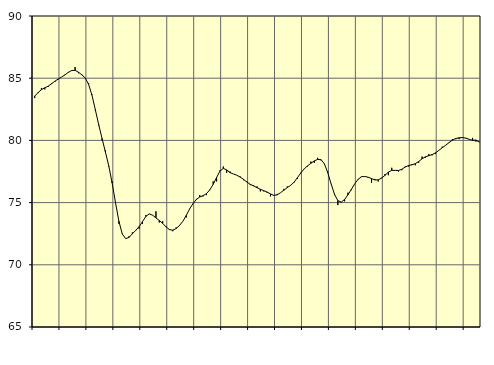
| Category | Piggar | Series 1 |
|---|---|---|
| nan | 83.4 | 83.56 |
| 87.0 | 83.8 | 83.84 |
| 87.0 | 84.2 | 84.08 |
| 87.0 | 84.1 | 84.23 |
| nan | 84.3 | 84.36 |
| 88.0 | 84.6 | 84.55 |
| 88.0 | 84.7 | 84.76 |
| 88.0 | 84.9 | 84.93 |
| nan | 85.1 | 85.1 |
| 89.0 | 85.3 | 85.27 |
| 89.0 | 85.5 | 85.47 |
| 89.0 | 85.6 | 85.62 |
| nan | 85.9 | 85.63 |
| 90.0 | 85.4 | 85.48 |
| 90.0 | 85.3 | 85.27 |
| 90.0 | 85 | 85.02 |
| nan | 84.6 | 84.51 |
| 91.0 | 83.7 | 83.64 |
| 91.0 | 82.4 | 82.47 |
| 91.0 | 81.2 | 81.27 |
| nan | 80 | 80.15 |
| 92.0 | 79.2 | 79.07 |
| 92.0 | 77.9 | 77.94 |
| 92.0 | 76.7 | 76.57 |
| nan | 75 | 74.99 |
| 93.0 | 73.3 | 73.5 |
| 93.0 | 72.5 | 72.48 |
| 93.0 | 72.1 | 72.1 |
| nan | 72.3 | 72.2 |
| 94.0 | 72.6 | 72.49 |
| 94.0 | 72.8 | 72.77 |
| 94.0 | 72.9 | 73.06 |
| nan | 73.3 | 73.47 |
| 95.0 | 74 | 73.89 |
| 95.0 | 74.1 | 74.09 |
| 95.0 | 74 | 73.99 |
| nan | 74.3 | 73.77 |
| 96.0 | 73.4 | 73.56 |
| 96.0 | 73.5 | 73.33 |
| 96.0 | 73.1 | 73.05 |
| nan | 72.8 | 72.83 |
| 97.0 | 72.7 | 72.78 |
| 97.0 | 73 | 72.92 |
| 97.0 | 73.2 | 73.16 |
| nan | 73.5 | 73.5 |
| 98.0 | 73.8 | 73.97 |
| 98.0 | 74.5 | 74.49 |
| 98.0 | 74.9 | 74.92 |
| nan | 75.3 | 75.25 |
| 99.0 | 75.6 | 75.45 |
| 99.0 | 75.5 | 75.56 |
| 99.0 | 75.6 | 75.72 |
| nan | 76 | 76.03 |
| 0.0 | 76.7 | 76.47 |
| 0.0 | 76.7 | 77.02 |
| 0.0 | 77.6 | 77.53 |
| nan | 77.9 | 77.75 |
| 1.0 | 77.4 | 77.63 |
| 1.0 | 77.5 | 77.41 |
| 1.0 | 77.3 | 77.3 |
| nan | 77.2 | 77.2 |
| 2.0 | 77.1 | 77.05 |
| 2.0 | 76.8 | 76.87 |
| 2.0 | 76.7 | 76.65 |
| nan | 76.4 | 76.47 |
| 3.0 | 76.4 | 76.34 |
| 3.0 | 76.3 | 76.2 |
| 3.0 | 75.9 | 76.07 |
| nan | 75.9 | 75.96 |
| 4.0 | 75.8 | 75.85 |
| 4.0 | 75.5 | 75.7 |
| 4.0 | 75.6 | 75.58 |
| nan | 75.7 | 75.62 |
| 5.0 | 75.8 | 75.8 |
| 5.0 | 76.1 | 76 |
| 5.0 | 76.3 | 76.21 |
| nan | 76.4 | 76.39 |
| 6.0 | 76.6 | 76.64 |
| 6.0 | 76.9 | 77 |
| 6.0 | 77.4 | 77.38 |
| nan | 77.7 | 77.71 |
| 7.0 | 77.9 | 77.95 |
| 7.0 | 78.3 | 78.16 |
| 7.0 | 78.2 | 78.35 |
| nan | 78.6 | 78.47 |
| 8.0 | 78.4 | 78.45 |
| 8.0 | 78.1 | 78.12 |
| 8.0 | 77.5 | 77.41 |
| nan | 76.5 | 76.51 |
| 9.0 | 75.6 | 75.67 |
| 9.0 | 74.8 | 75.16 |
| 9.0 | 75 | 75.04 |
| nan | 75.1 | 75.25 |
| 10.0 | 75.8 | 75.63 |
| 10.0 | 76 | 76.06 |
| 10.0 | 76.5 | 76.5 |
| nan | 76.9 | 76.87 |
| 11.0 | 77.1 | 77.08 |
| 11.0 | 77.1 | 77.1 |
| 11.0 | 77 | 77.04 |
| nan | 76.6 | 76.93 |
| 12.0 | 76.9 | 76.82 |
| 12.0 | 76.7 | 76.83 |
| 12.0 | 77 | 76.97 |
| nan | 77.3 | 77.19 |
| 13.0 | 77.2 | 77.45 |
| 13.0 | 77.8 | 77.59 |
| 13.0 | 77.6 | 77.59 |
| nan | 77.5 | 77.58 |
| 14.0 | 77.6 | 77.68 |
| 14.0 | 77.9 | 77.86 |
| 14.0 | 77.9 | 77.98 |
| nan | 78.1 | 78.04 |
| 15.0 | 78 | 78.13 |
| 15.0 | 78.2 | 78.3 |
| 15.0 | 78.7 | 78.52 |
| nan | 78.6 | 78.68 |
| 16.0 | 78.9 | 78.77 |
| 16.0 | 78.8 | 78.86 |
| 16.0 | 78.9 | 79 |
| nan | 79.2 | 79.2 |
| 17.0 | 79.5 | 79.41 |
| 17.0 | 79.6 | 79.61 |
| 17.0 | 79.8 | 79.82 |
| nan | 80.1 | 80.02 |
| 18.0 | 80.1 | 80.15 |
| 18.0 | 80.1 | 80.21 |
| 18.0 | 80.2 | 80.23 |
| nan | 80.2 | 80.18 |
| 19.0 | 80.1 | 80.09 |
| 19.0 | 80.2 | 80 |
| 19.0 | 79.9 | 80.03 |
| nan | 79.9 | 79.86 |